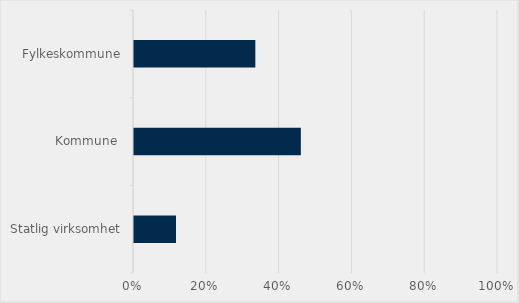
| Category | Series 0 |
|---|---|
| Statlig virksomhet | 0.115 |
| Kommune  | 0.458 |
| Fylkeskommune | 0.333 |